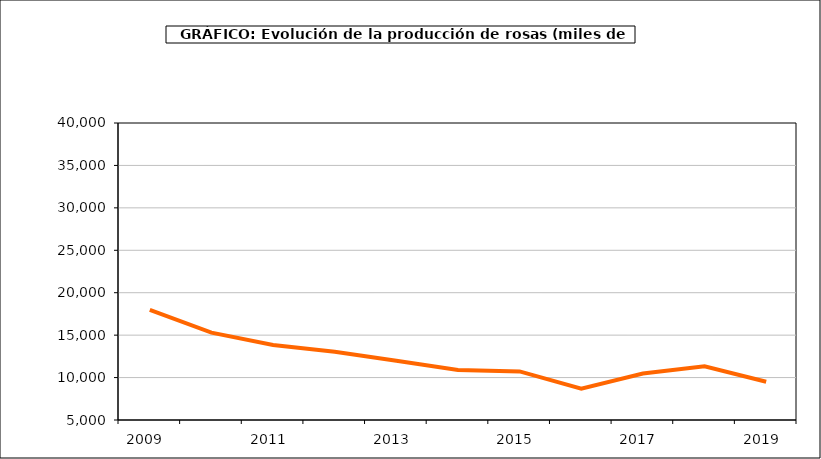
| Category | producción |
|---|---|
| 2009.0 | 17983 |
| 2010.0 | 15301 |
| 2011.0 | 13840 |
| 2012.0 | 13038 |
| 2013.0 | 11993 |
| 2014.0 | 10897 |
| 2015.0 | 10725 |
| 2016.0 | 8682 |
| 2017.0 | 10480 |
| 2018.0 | 11340 |
| 2019.0 | 9513 |